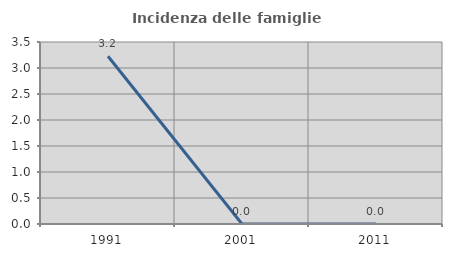
| Category | Incidenza delle famiglie numerose |
|---|---|
| 1991.0 | 3.226 |
| 2001.0 | 0 |
| 2011.0 | 0 |